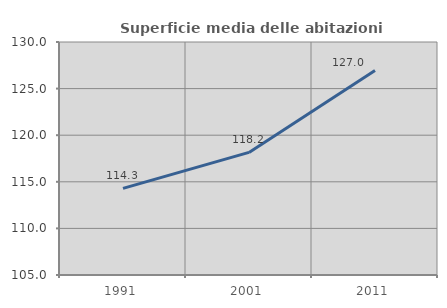
| Category | Superficie media delle abitazioni occupate |
|---|---|
| 1991.0 | 114.296 |
| 2001.0 | 118.154 |
| 2011.0 | 126.952 |